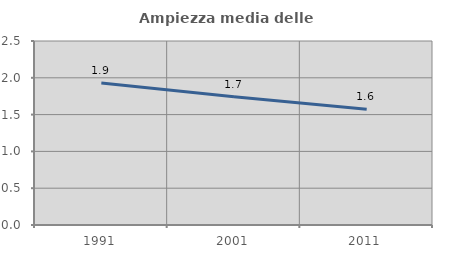
| Category | Ampiezza media delle famiglie |
|---|---|
| 1991.0 | 1.929 |
| 2001.0 | 1.742 |
| 2011.0 | 1.572 |